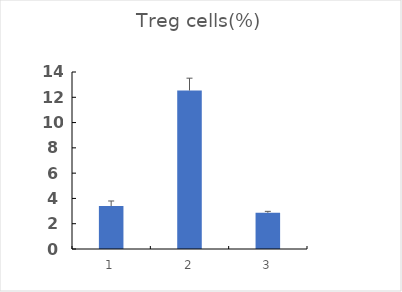
| Category | Series 0 |
|---|---|
| 0 | 3.393 |
| 1 | 12.533 |
| 2 | 2.867 |